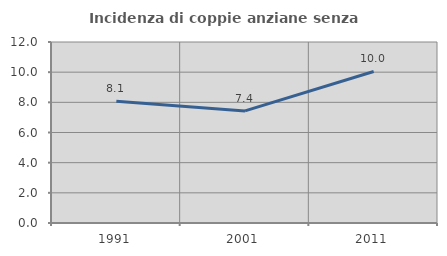
| Category | Incidenza di coppie anziane senza figli  |
|---|---|
| 1991.0 | 8.07 |
| 2001.0 | 7.43 |
| 2011.0 | 10.045 |